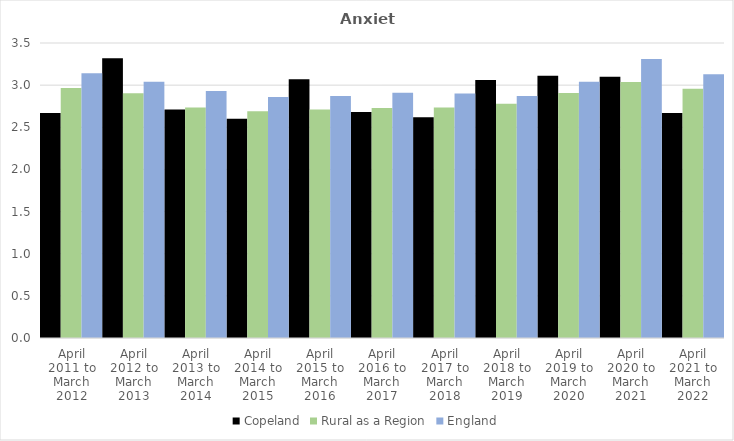
| Category | Copeland | Rural as a Region | England |
|---|---|---|---|
| April 2011 to March 2012 | 2.67 | 2.967 | 3.14 |
| April 2012 to March 2013 | 3.32 | 2.904 | 3.04 |
| April 2013 to March 2014 | 2.71 | 2.734 | 2.93 |
| April 2014 to March 2015 | 2.6 | 2.691 | 2.86 |
| April 2015 to March 2016 | 3.07 | 2.711 | 2.87 |
| April 2016 to March 2017 | 2.68 | 2.729 | 2.91 |
| April 2017 to March 2018 | 2.62 | 2.736 | 2.9 |
| April 2018 to March 2019 | 3.06 | 2.78 | 2.87 |
| April 2019 to March 2020 | 3.11 | 2.908 | 3.04 |
| April 2020 to March 2021 | 3.1 | 3.036 | 3.31 |
| April 2021 to March 2022 | 2.67 | 2.956 | 3.13 |